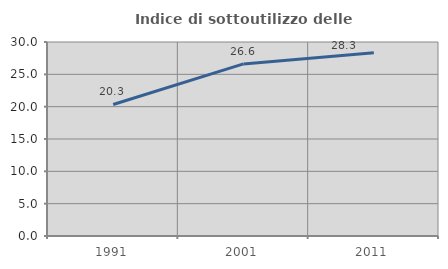
| Category | Indice di sottoutilizzo delle abitazioni  |
|---|---|
| 1991.0 | 20.34 |
| 2001.0 | 26.612 |
| 2011.0 | 28.33 |